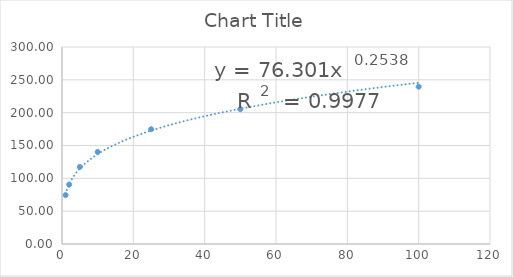
| Category | Series 0 |
|---|---|
| 1.0 | 74.44 |
| 2.0 | 90.445 |
| 5.0 | 117.376 |
| 10.0 | 140.241 |
| 25.0 | 174.793 |
| 50.0 | 205.28 |
| 100.0 | 239.579 |